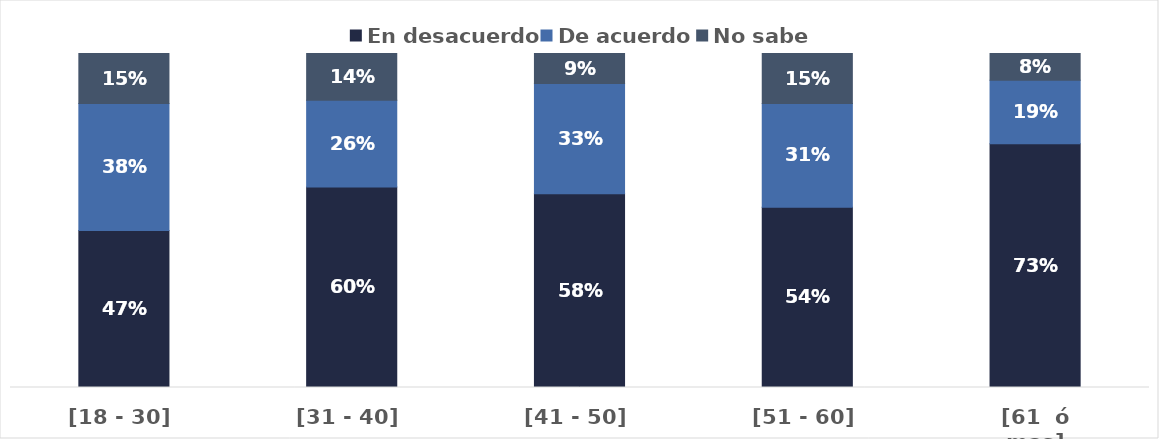
| Category | En desacuerdo | De acuerdo | No sabe |
|---|---|---|---|
| [18 - 30] | 0.47 | 0.38 | 0.15 |
| [31 - 40] | 0.6 | 0.26 | 0.14 |
| [41 - 50] | 0.58 | 0.33 | 0.09 |
| [51 - 60] | 0.54 | 0.31 | 0.15 |
| [61  ó mas] | 0.73 | 0.19 | 0.08 |